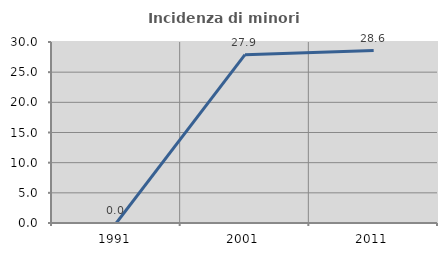
| Category | Incidenza di minori stranieri |
|---|---|
| 1991.0 | 0 |
| 2001.0 | 27.907 |
| 2011.0 | 28.571 |